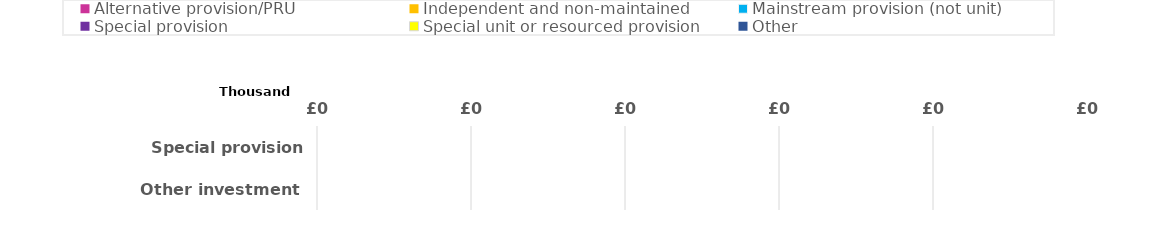
| Category | Alternative provision/PRU | Independent and non-maintained | Mainstream provision (not unit) | Special provision | Special unit or resourced provision | Other |
|---|---|---|---|---|---|---|
| Special provision fund | 0 | 0 | 0 | 0 | 0 | 0 |
| Other investment | 0 | 0 | 0 | 0 | 0 | 0 |